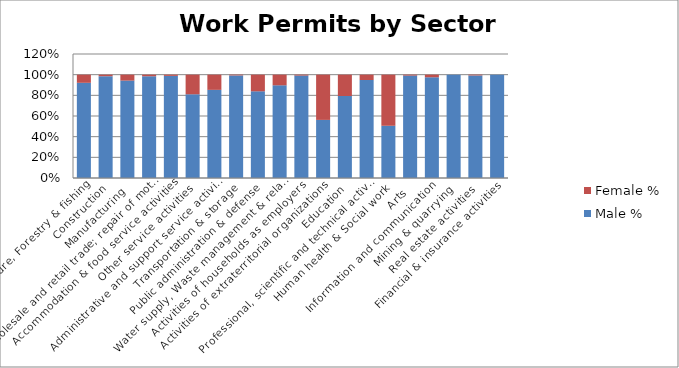
| Category | Male % | Female % |
|---|---|---|
| Agriculture, Forestry & fishing | 0.921 | 0.079 |
| Construction | 0.985 | 0.015 |
| Manufacturing | 0.943 | 0.057 |
| Wholesale and retail trade; repair of motor vehicles  | 0.985 | 0.015 |
| Accommodation & food service activities | 0.988 | 0.012 |
| Other service activities | 0.81 | 0.19 |
| Administrative and support service activities | 0.853 | 0.147 |
| Transportation & storage | 0.993 | 0.007 |
| Public administration & defense | 0.839 | 0.161 |
| Water supply, Waste management & related activities | 0.897 | 0.103 |
| Activities of households as employers | 0.991 | 0.009 |
| Activities of extraterritorial organizations  | 0.562 | 0.438 |
| Education | 0.793 | 0.207 |
| Professional, scientific and technical activities | 0.948 | 0.052 |
| Human health & Social work | 0.505 | 0.495 |
| Arts | 0.991 | 0.009 |
| Information and communication | 0.975 | 0.025 |
| Mining & quarrying | 1 | 0 |
| Real estate activities | 0.993 | 0.007 |
| Financial & insurance activities | 1 | 0 |